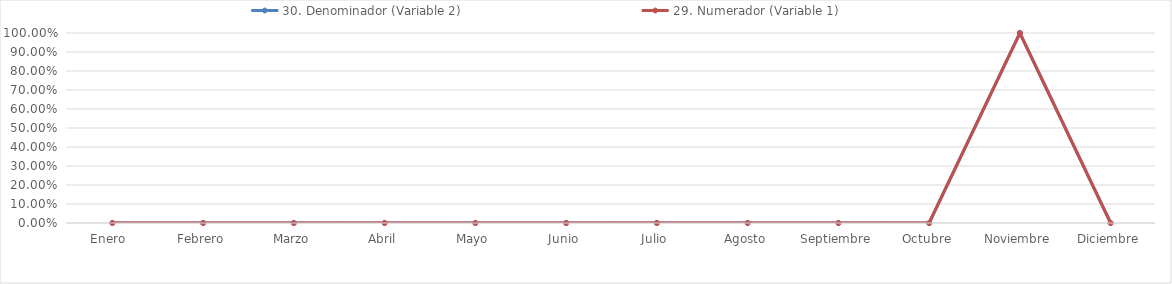
| Category | 30. Denominador (Variable 2) | 29. Numerador (Variable 1) |
|---|---|---|
| Enero  | 0 | 0 |
| Febrero | 0 | 0 |
| Marzo | 0 | 0 |
| Abril | 0 | 0 |
| Mayo | 0 | 0 |
| Junio | 0 | 0 |
| Julio | 0 | 0 |
| Agosto | 0 | 0 |
| Septiembre | 0 | 0 |
| Octubre | 0 | 0 |
| Noviembre | 1 | 1 |
| Diciembre | 0 | 0 |